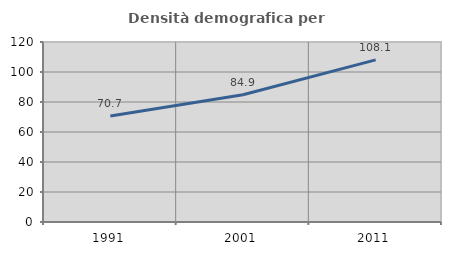
| Category | Densità demografica |
|---|---|
| 1991.0 | 70.735 |
| 2001.0 | 84.853 |
| 2011.0 | 108.099 |